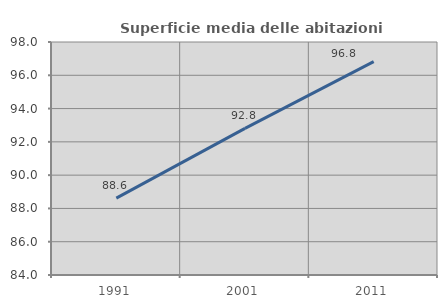
| Category | Superficie media delle abitazioni occupate |
|---|---|
| 1991.0 | 88.618 |
| 2001.0 | 92.813 |
| 2011.0 | 96.82 |